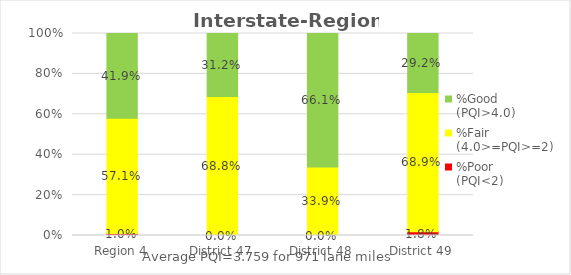
| Category | %Poor
(PQI<2) | %Fair
(4.0>=PQI>=2) | %Good
(PQI>4.0) |
|---|---|---|---|
| Region 4 | 0.01 | 0.571 | 0.419 |
| District 47 | 0 | 0.688 | 0.312 |
| District 48 | 0 | 0.339 | 0.661 |
| District 49 | 0.018 | 0.689 | 0.292 |